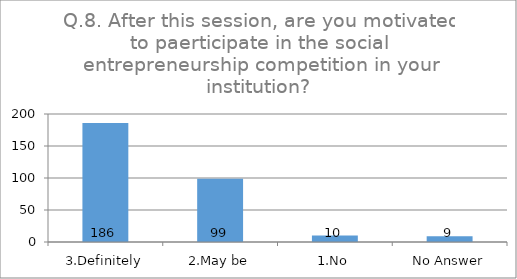
| Category | Q.8. After this session, are you motivated to paerticipate in the social entrepreneurship competition in your institution? |
|---|---|
| 3.Definitely | 186 |
| 2.May be | 99 |
| 1.No | 10 |
| No Answer | 9 |